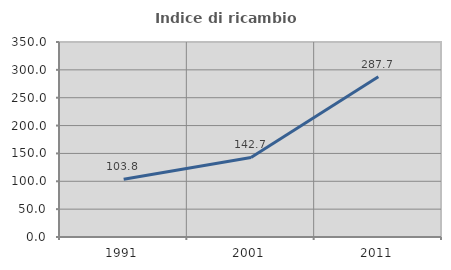
| Category | Indice di ricambio occupazionale  |
|---|---|
| 1991.0 | 103.777 |
| 2001.0 | 142.736 |
| 2011.0 | 287.7 |